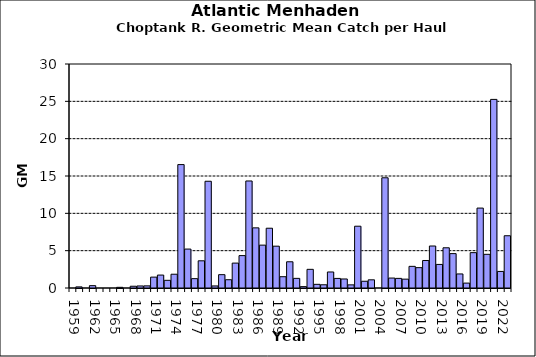
| Category | Series 0 |
|---|---|
| 1959.0 | 0 |
| 1960.0 | 0.149 |
| 1961.0 | 0 |
| 1962.0 | 0.314 |
| 1963.0 | 0 |
| 1964.0 | 0 |
| 1965.0 | 0 |
| 1966.0 | 0.091 |
| 1967.0 | 0 |
| 1968.0 | 0.235 |
| 1969.0 | 0.272 |
| 1970.0 | 0.285 |
| 1971.0 | 1.457 |
| 1972.0 | 1.731 |
| 1973.0 | 1.028 |
| 1974.0 | 1.844 |
| 1975.0 | 16.528 |
| 1976.0 | 5.213 |
| 1977.0 | 1.252 |
| 1978.0 | 3.643 |
| 1979.0 | 14.295 |
| 1980.0 | 0.275 |
| 1981.0 | 1.786 |
| 1982.0 | 1.107 |
| 1983.0 | 3.334 |
| 1984.0 | 4.338 |
| 1985.0 | 14.334 |
| 1986.0 | 8.056 |
| 1987.0 | 5.742 |
| 1988.0 | 8.005 |
| 1989.0 | 5.601 |
| 1990.0 | 1.513 |
| 1991.0 | 3.513 |
| 1992.0 | 1.29 |
| 1993.0 | 0.183 |
| 1994.0 | 2.499 |
| 1995.0 | 0.491 |
| 1996.0 | 0.431 |
| 1997.0 | 2.146 |
| 1998.0 | 1.283 |
| 1999.0 | 1.208 |
| 2000.0 | 0.42 |
| 2001.0 | 8.276 |
| 2002.0 | 0.903 |
| 2003.0 | 1.096 |
| 2004.0 | 0 |
| 2005.0 | 14.762 |
| 2006.0 | 1.332 |
| 2007.0 | 1.288 |
| 2008.0 | 1.186 |
| 2009.0 | 2.9 |
| 2010.0 | 2.725 |
| 2011.0 | 3.684 |
| 2012.0 | 5.623 |
| 2013.0 | 3.158 |
| 2014.0 | 5.386 |
| 2015.0 | 4.605 |
| 2016.0 | 1.883 |
| 2017.0 | 0.655 |
| 2018.0 | 4.734 |
| 2019.0 | 10.703 |
| 2020.0 | 4.51 |
| 2021.0 | 25.259 |
| 2022.0 | 2.22 |
| 2023.0 | 6.999 |